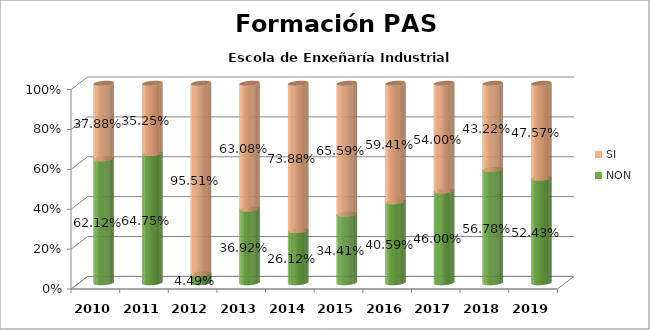
| Category | NON | SI |
|---|---|---|
| 2010.0 | 0.621 | 0.379 |
| 2011.0 | 0.647 | 0.353 |
| 2012.0 | 0.045 | 0.955 |
| 2013.0 | 0.369 | 0.631 |
| 2014.0 | 0.261 | 0.739 |
| 2015.0 | 0.344 | 0.656 |
| 2016.0 | 0.406 | 0.594 |
| 2017.0 | 0.46 | 0.54 |
| 2018.0 | 0.568 | 0.432 |
| 2019.0 | 0.524 | 0.476 |